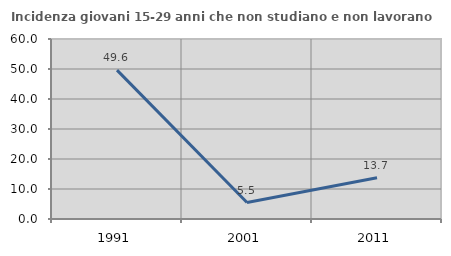
| Category | Incidenza giovani 15-29 anni che non studiano e non lavorano  |
|---|---|
| 1991.0 | 49.611 |
| 2001.0 | 5.486 |
| 2011.0 | 13.748 |